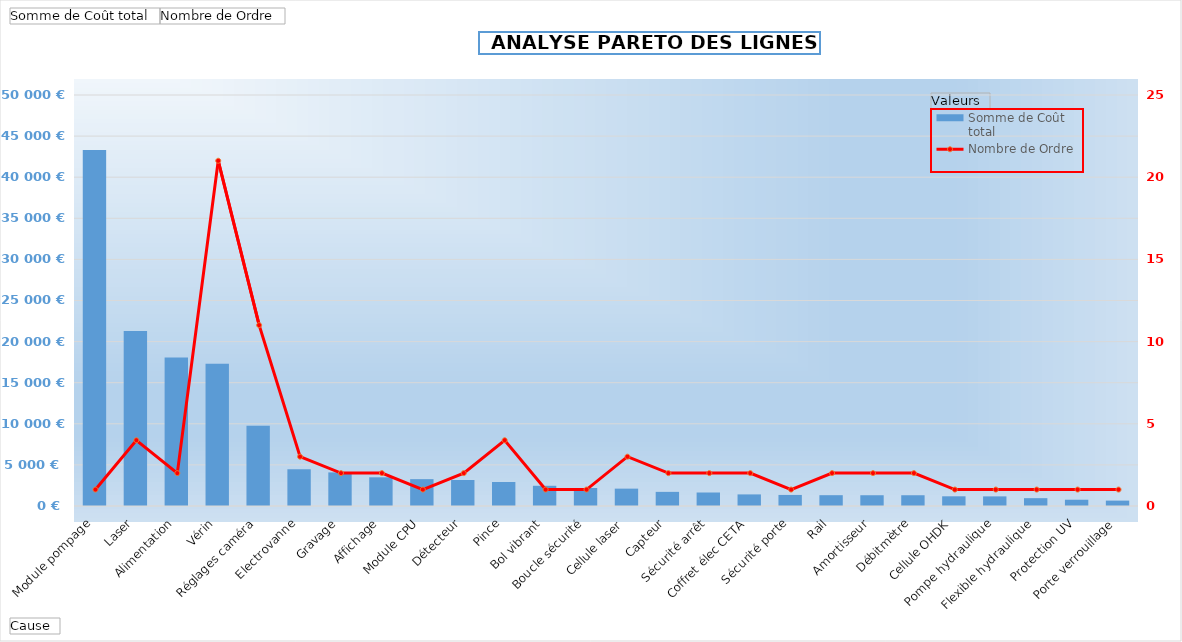
| Category | Somme de Coût total |
|---|---|
| Module pompage | 43314.86 |
| Laser | 21289.45 |
| Alimentation | 18073.13 |
| Vérin | 17297.47 |
| Réglages caméra | 9774.49 |
| Electrovanne | 4470.25 |
| Gravage | 4087.26 |
| Affichage | 3490.16 |
| Module CPU | 3266.32 |
| Détecteur | 3164.77 |
| Pince | 2923.15 |
| Bol vibrant | 2459.04 |
| Boucle sécurité | 2188.85 |
| Cellule laser | 2112.77 |
| Capteur | 1720.43 |
| Sécurité arrêt | 1643.05 |
| Coffret élec CETA | 1410.81 |
| Sécurité porte | 1345.61 |
| Rail | 1316.5 |
| Amortisseur | 1310 |
| Débitmètre | 1309.46 |
| Cellule OHDK | 1180.1 |
| Pompe hydraulique | 1170.83 |
| Flexible hydraulique | 953.24 |
| Protection UV | 762.2 |
| Porte verrouillage | 655.37 |